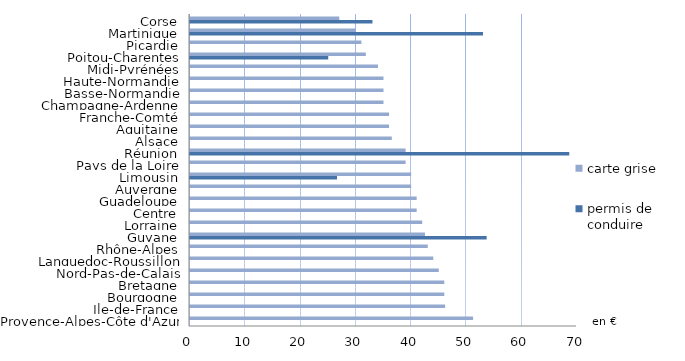
| Category | permis de conduire | carte grise |
|---|---|---|
| Provence-Alpes-Côte d'Azur | 0 | 51.2 |
| Ile-de-France | 0 | 46.15 |
| Bourgogne | 0 | 46 |
| Bretagne | 0 | 46 |
| Nord-Pas-de-Calais | 0 | 45 |
| Languedoc-Roussillon | 0 | 44 |
| Rhône-Alpes | 0 | 43 |
| Guyane | 53.66 | 42.5 |
| Lorraine | 0 | 42 |
| Centre | 0 | 41 |
| Guadeloupe | 0 | 41 |
| Auvergne | 0 | 40 |
| Limousin | 26.6 | 40 |
| Pays de la Loire | 0 | 39 |
| Réunion | 68.6 | 39 |
| Alsace | 0 | 36.5 |
| Aquitaine | 0 | 36 |
| Franche-Comté | 0 | 36 |
| Champagne-Ardenne | 0 | 35 |
| Basse-Normandie | 0 | 35 |
| Haute-Normandie | 0 | 35 |
| Midi-Pyrénées | 0 | 34 |
| Poitou-Charentes | 25 | 31.8 |
| Picardie | 0 | 31 |
| Martinique | 53 | 30 |
| Corse | 33 | 27 |